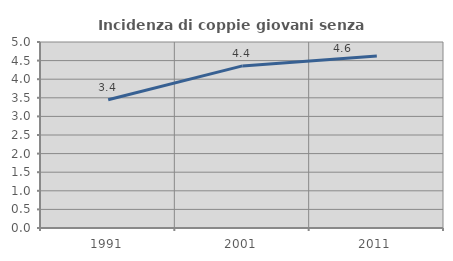
| Category | Incidenza di coppie giovani senza figli |
|---|---|
| 1991.0 | 3.448 |
| 2001.0 | 4.357 |
| 2011.0 | 4.626 |